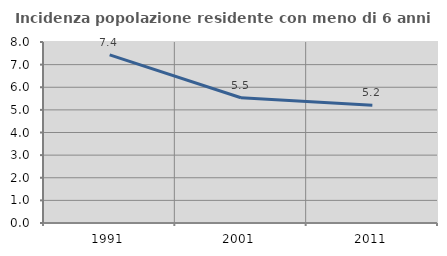
| Category | Incidenza popolazione residente con meno di 6 anni |
|---|---|
| 1991.0 | 7.428 |
| 2001.0 | 5.534 |
| 2011.0 | 5.204 |